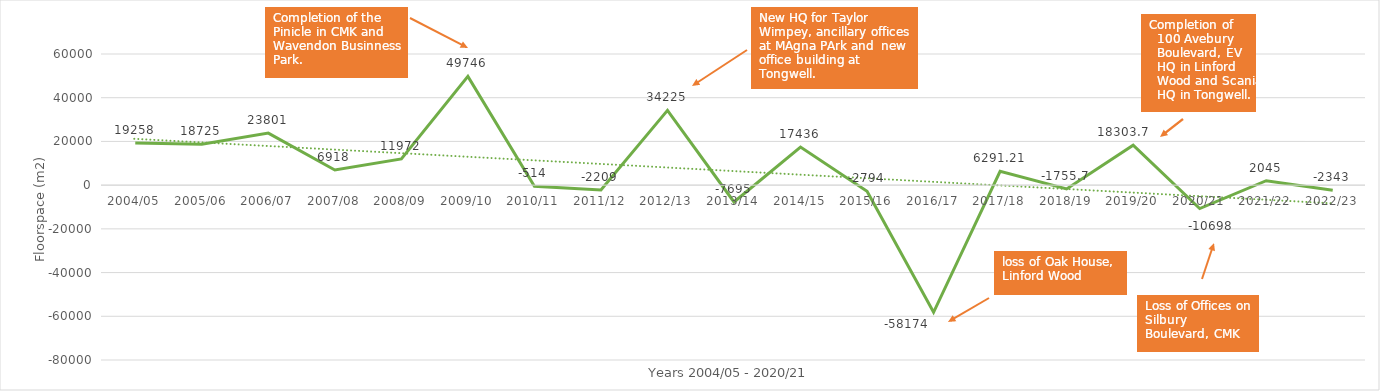
| Category | Series 0 |
|---|---|
| 2004/05 | 19258 |
| 2005/06 | 18725 |
| 2006/07 | 23801 |
| 2007/08 | 6918 |
| 2008/09 | 11972 |
| 2009/10 | 49746 |
| 2010/11 | -514 |
| 2011/12 | -2209 |
| 2012/13 | 34225 |
| 2013/14 | -7695 |
| 2014/15 | 17436 |
| 2015/16 | -2794 |
| 2016/17 | -58174 |
| 2017/18 | 6291.21 |
| 2018/19 | -1755.7 |
| 2019/20 | 18303.7 |
| 2020/21 | -10698 |
| 2021/22 | 2045 |
| 2022/23 | -2343 |